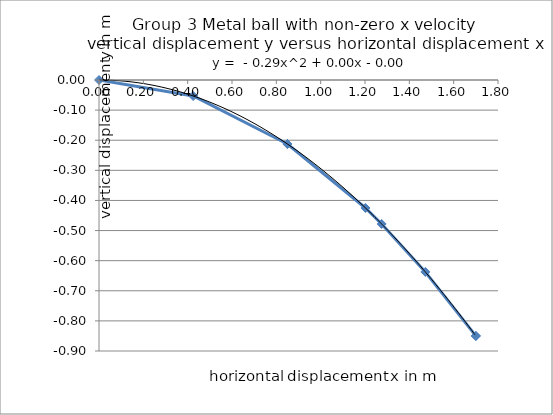
| Category | Series 0 |
|---|---|
| 0.0 | 0 |
| 0.425 | -0.053 |
| 0.85 | -0.212 |
| 0.8500000000000001 | -0.212 |
| 1.2020815280171309 | -0.425 |
| 1.275 | -0.478 |
| 1.4722431864335457 | -0.638 |
| 1.7 | -0.85 |
| 1.7 | -0.85 |